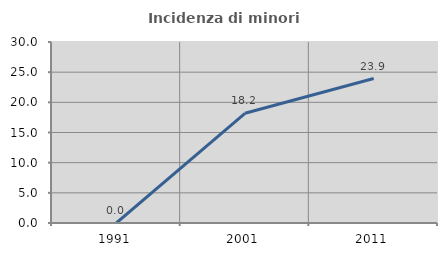
| Category | Incidenza di minori stranieri |
|---|---|
| 1991.0 | 0 |
| 2001.0 | 18.182 |
| 2011.0 | 23.94 |